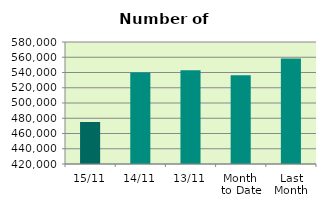
| Category | Series 0 |
|---|---|
| 15/11 | 475204 |
| 14/11 | 540060 |
| 13/11 | 542872 |
| Month 
to Date | 536552 |
| Last
Month | 558199.478 |